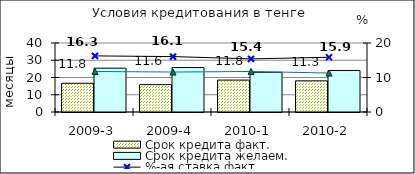
| Category | Срок кредита факт.  | Срок кредита желаем. |
|---|---|---|
| 2009-3 | 16.66 | 25.4 |
| 2009-4 | 15.84 | 25.78 |
| 2010-1 | 18.51 | 23.02 |
| 2010-2 | 18.06 | 24.07 |